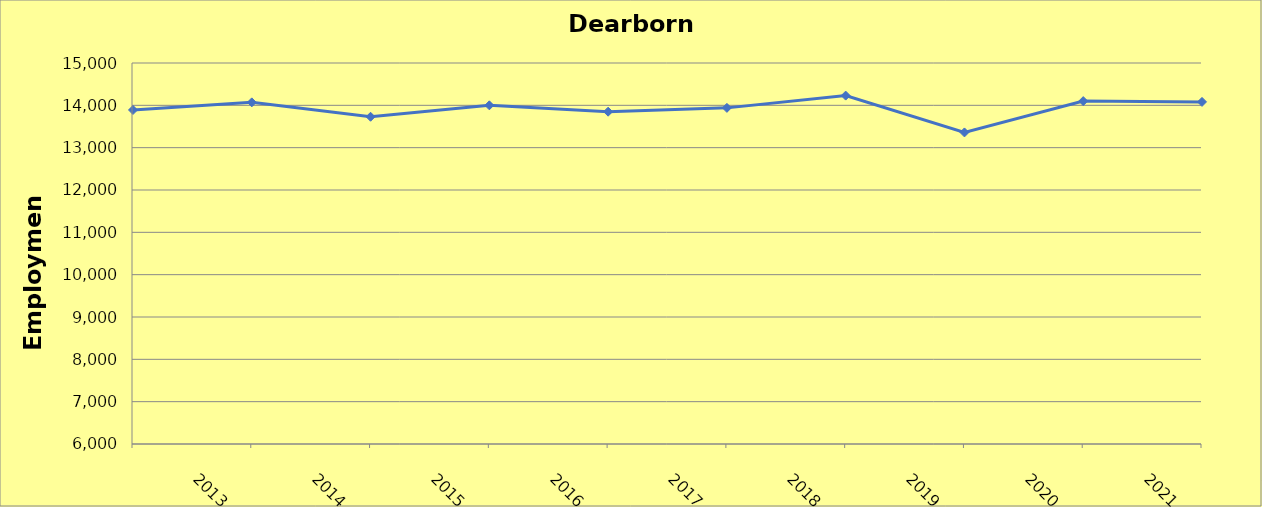
| Category | Dearborn County |
|---|---|
| 2013.0 | 13890 |
| 2014.0 | 14070 |
| 2015.0 | 13730 |
| 2016.0 | 14000 |
| 2017.0 | 13850 |
| 2018.0 | 13940 |
| 2019.0 | 14230 |
| 2020.0 | 13360 |
| 2021.0 | 14100 |
| 2022.0 | 14081 |